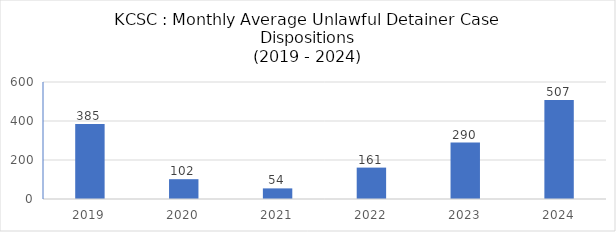
| Category | Series 0 |
|---|---|
| 2019.0 | 384.75 |
| 2020.0 | 101.583 |
| 2021.0 | 54.417 |
| 2022.0 | 161 |
| 2023.0 | 289.667 |
| 2024.0 | 507.2 |